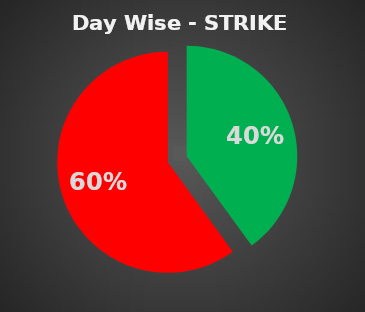
| Category | Series 0 |
|---|---|
| 0 | 0.4 |
| 1 | 0.6 |